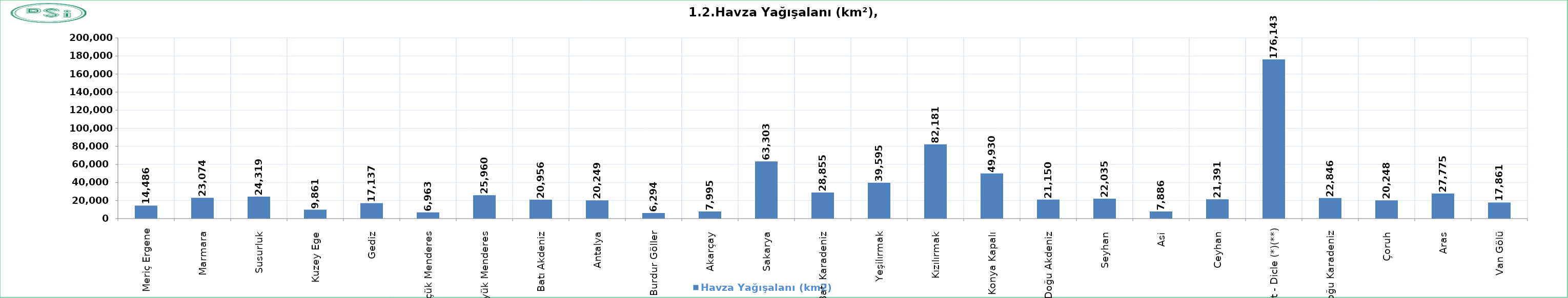
| Category | Havza Yağışalanı (km2) |
|---|---|
| Meriç Ergene | 14486 |
| Marmara  | 23074 |
| Susurluk  | 24319 |
| Kuzey Ege  | 9861 |
| Gediz  | 17137 |
| Küçük Menderes  | 6963 |
| Büyük Menderes  | 25960 |
| Batı Akdeniz  | 20956 |
| Antalya  | 20249 |
| Burdur Göller  | 6294 |
| Akarçay  | 7995 |
| Sakarya  | 63303 |
| Batı Karadeniz  | 28855 |
| Yeşilırmak  | 39595 |
| Kızılırmak  | 82181 |
| Konya Kapalı  | 49930 |
| Doğu Akdeniz  | 21150 |
| Seyhan  | 22035 |
| Asi  | 7886 |
| Ceyhan  | 21391 |
| Fırat - Dicle (*)(**) | 176143 |
| Doğu Karadeniz  | 22846 |
| Çoruh  | 20248 |
| Aras  | 27775 |
| Van Gölü  | 17861 |